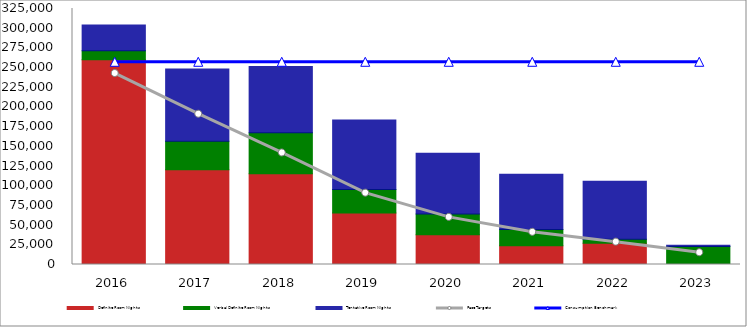
| Category | Definite Room Nights | Verbal Definite Room Nights | Tentative Room Nights |
|---|---|---|---|
| 2016.0 | 259857 | 11576 | 32741 |
| 2017.0 | 120225 | 36210 | 91789 |
| 2018.0 | 115189 | 51942 | 84278 |
| 2019.0 | 65420 | 29689 | 88247 |
| 2020.0 | 37701 | 26445 | 77031 |
| 2021.0 | 23925 | 20387 | 70407 |
| 2022.0 | 27014 | 5000 | 73729 |
| 2023.0 | 0 | 22743 | 1750 |